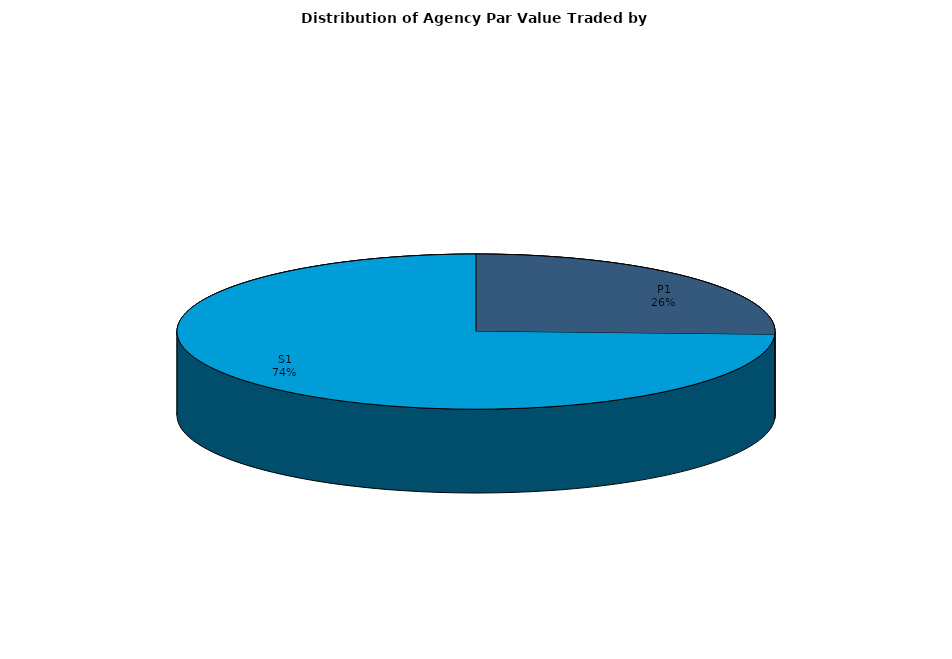
| Category | Series 0 |
|---|---|
| P1 | 1843376551.562 |
| S1 | 5340173157.734 |